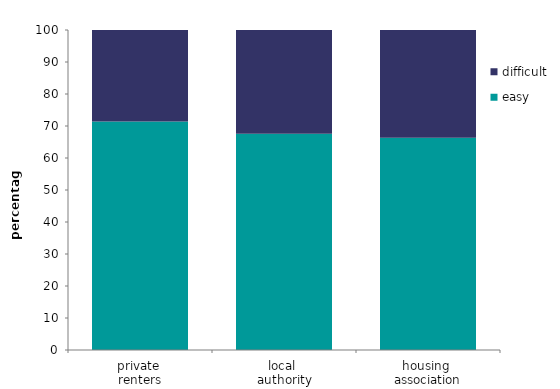
| Category | easy | difficult |
|---|---|---|
| private 
renters | 71.383 | 28.617 |
| local 
authority | 67.561 | 32.439 |
| housing 
association | 66.339 | 33.661 |